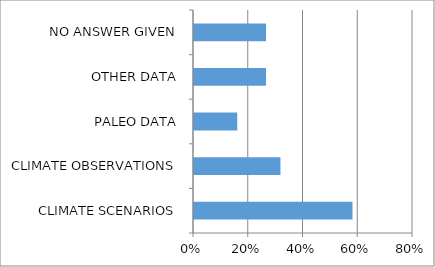
| Category | Series 0 |
|---|---|
| CLIMATE SCENARIOS | 0.579 |
| CLIMATE OBSERVATIONS | 0.316 |
| PALEO DATA | 0.158 |
| OTHER DATA | 0.263 |
| NO ANSWER GIVEN | 0.263 |